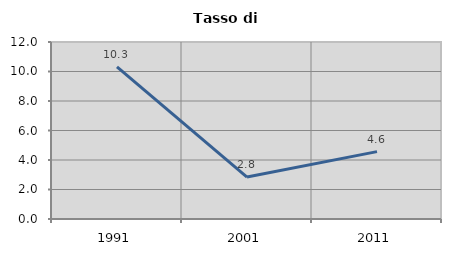
| Category | Tasso di disoccupazione   |
|---|---|
| 1991.0 | 10.317 |
| 2001.0 | 2.844 |
| 2011.0 | 4.566 |